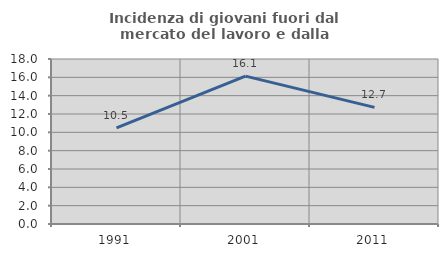
| Category | Incidenza di giovani fuori dal mercato del lavoro e dalla formazione  |
|---|---|
| 1991.0 | 10.484 |
| 2001.0 | 16.129 |
| 2011.0 | 12.727 |